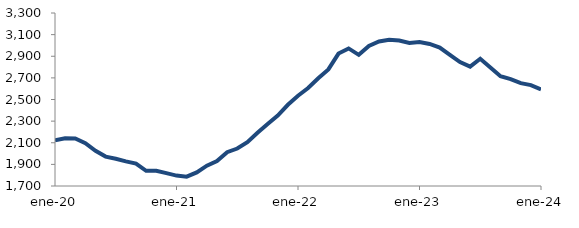
| Category | Series 0 |
|---|---|
| 2020-01-01 | 2121.854 |
| 2020-02-01 | 2141.715 |
| 2020-03-01 | 2140.312 |
| 2020-04-01 | 2095.806 |
| 2020-05-01 | 2025.041 |
| 2020-06-01 | 1971.807 |
| 2020-07-01 | 1951.466 |
| 2020-08-01 | 1927.763 |
| 2020-09-01 | 1907.078 |
| 2020-10-01 | 1840.778 |
| 2020-11-01 | 1841.166 |
| 2020-12-01 | 1819.546 |
| 2021-01-01 | 1796.45 |
| 2021-02-01 | 1786.603 |
| 2021-03-01 | 1826.072 |
| 2021-04-01 | 1887.798 |
| 2021-05-01 | 1930.372 |
| 2021-06-01 | 2012.926 |
| 2021-07-01 | 2046.434 |
| 2021-08-01 | 2105.806 |
| 2021-09-01 | 2192.514 |
| 2021-10-01 | 2272.972 |
| 2021-11-01 | 2351.334 |
| 2021-12-01 | 2451.171 |
| 2022-01-01 | 2534.613 |
| 2022-02-01 | 2606.357 |
| 2022-03-01 | 2696.948 |
| 2022-04-01 | 2778.264 |
| 2022-05-01 | 2924.682 |
| 2022-06-01 | 2972.281 |
| 2022-07-01 | 2912.933 |
| 2022-08-01 | 2994.913 |
| 2022-09-01 | 3036.467 |
| 2022-10-01 | 3052.236 |
| 2022-11-01 | 3044.767 |
| 2022-12-01 | 3023.141 |
| 2023-01-01 | 3030.956 |
| 2023-02-01 | 3013.674 |
| 2023-03-01 | 2979.861 |
| 2023-04-01 | 2913.014 |
| 2023-05-01 | 2845.832 |
| 2023-06-01 | 2803.594 |
| 2023-07-01 | 2876.7 |
| 2023-08-01 | 2796.297 |
| 2023-09-01 | 2715.691 |
| 2023-10-01 | 2689.066 |
| 2023-11-01 | 2650.837 |
| 2023-12-01 | 2633.487 |
| 2024-01-01 | 2592.905 |